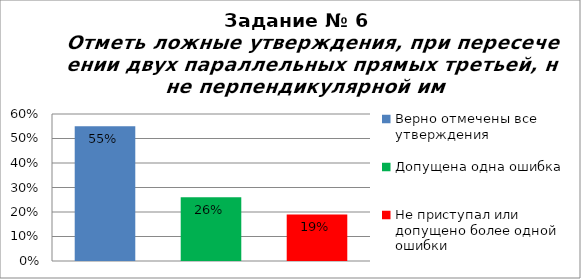
| Category | Отметь ложные утверждения, при пересечении двух параллельных прямых третьей, не перпендикулярной им. |
|---|---|
| Верно отмечены все утверждения | 0.55 |
| Допущена одна ошибка | 0.26 |
| Не приступал или допущено более одной ошибки | 0.19 |